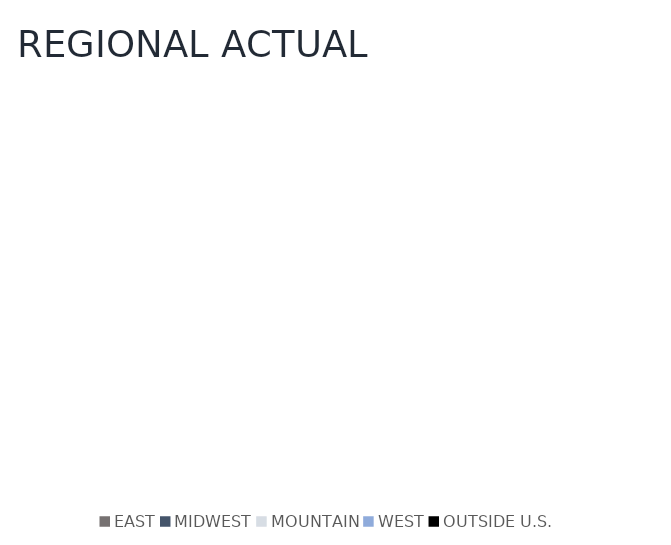
| Category | Series 0 |
|---|---|
| EAST | 0 |
| MIDWEST | 0 |
| MOUNTAIN | 0 |
| WEST | 0 |
| OUTSIDE U.S. | 0 |